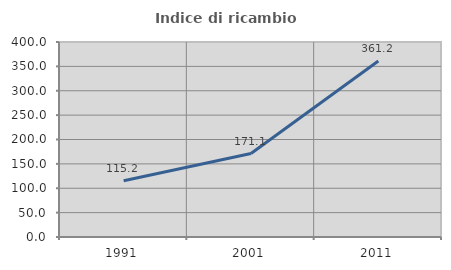
| Category | Indice di ricambio occupazionale  |
|---|---|
| 1991.0 | 115.235 |
| 2001.0 | 171.108 |
| 2011.0 | 361.196 |